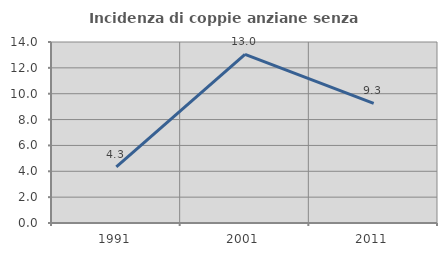
| Category | Incidenza di coppie anziane senza figli  |
|---|---|
| 1991.0 | 4.348 |
| 2001.0 | 13.043 |
| 2011.0 | 9.259 |